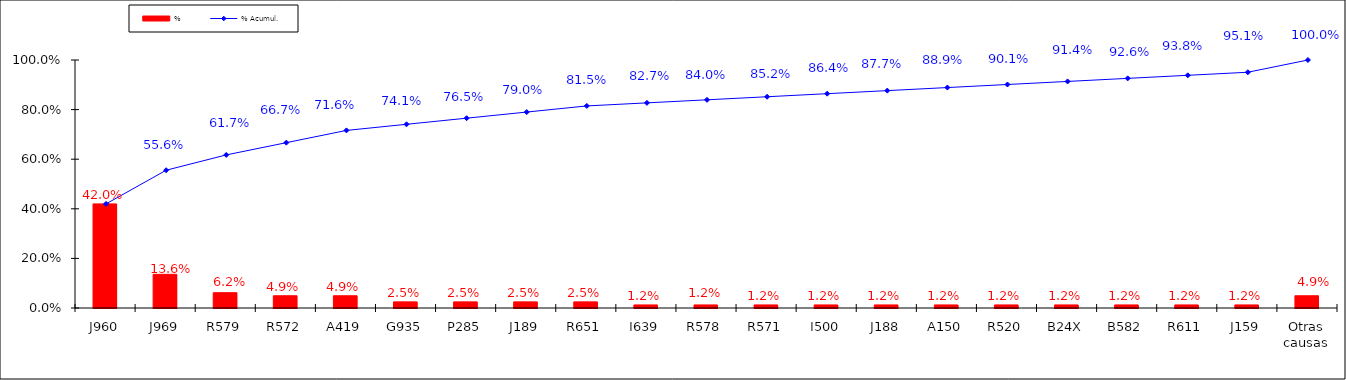
| Category | % |
|---|---|
| J960 | 0.42 |
| J969 | 0.136 |
| R579 | 0.062 |
| R572 | 0.049 |
| A419 | 0.049 |
| G935 | 0.025 |
| P285 | 0.025 |
| J189 | 0.025 |
| R651 | 0.025 |
| I639 | 0.012 |
| R578 | 0.012 |
| R571 | 0.012 |
| I500 | 0.012 |
| J188 | 0.012 |
| A150 | 0.012 |
| R520 | 0.012 |
| B24X | 0.012 |
| B582 | 0.012 |
| R611 | 0.012 |
| J159 | 0.012 |
| Otras causas | 0.049 |